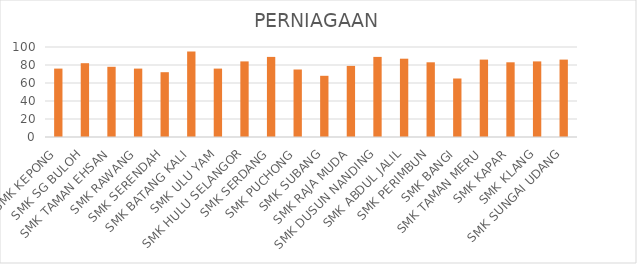
| Category | PERNIAGAAN |
|---|---|
| SMK KEPONG | 76 |
| SMK SG BULOH | 82 |
| SMK TAMAN EHSAN | 78 |
| SMK RAWANG | 76 |
| SMK SERENDAH | 72 |
| SMK BATANG KALI | 95 |
| SMK ULU YAM | 76 |
| SMK HULU SELANGOR | 84 |
| SMK SERDANG | 89 |
| SMK PUCHONG | 75 |
| SMK SUBANG | 68 |
| SMK RAJA MUDA | 79 |
| SMK DUSUN NANDING | 89 |
| SMK ABDUL JALIL | 87 |
| SMK PERIMBUN | 83 |
| SMK BANGI | 65 |
| SMK TAMAN MERU | 86 |
| SMK KAPAR | 83 |
| SMK KLANG | 84 |
| SMK SUNGAI UDANG | 86 |